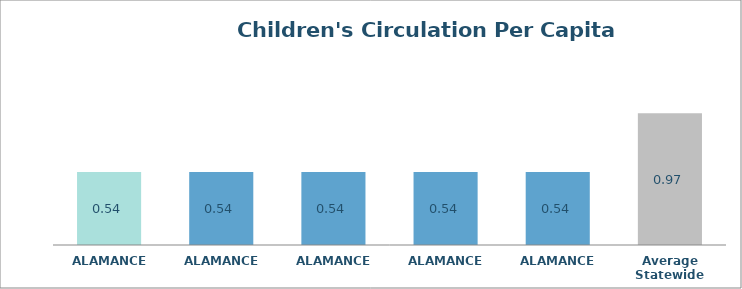
| Category | Physical |
|---|---|
| ALAMANCE  | 0.538 |
| ALAMANCE  | 0.538 |
| ALAMANCE  | 0.538 |
| ALAMANCE  | 0.538 |
| ALAMANCE  | 0.538 |
| Average Statewide | 0.97 |